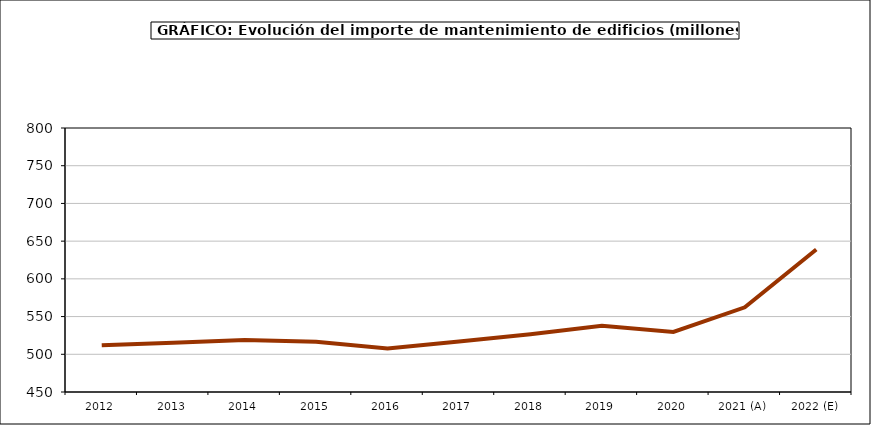
| Category | mantenimiento |
|---|---|
| 2012 | 512.04 |
| 2013 | 515.387 |
| 2014 | 518.885 |
| 2015 | 516.507 |
| 2016 | 507.665 |
| 2017 | 516.979 |
| 2018 | 526.443 |
| 2019 | 537.976 |
| 2020 | 529.672 |
| 2021 (A) | 562.29 |
| 2022 (E) | 638.861 |